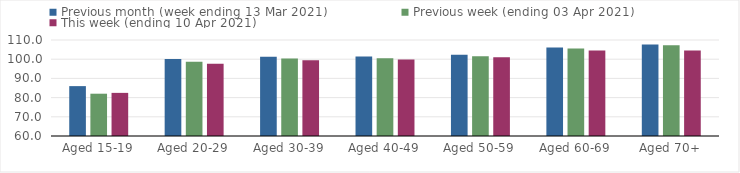
| Category | Previous month (week ending 13 Mar 2021) | Previous week (ending 03 Apr 2021) | This week (ending 10 Apr 2021) |
|---|---|---|---|
| Aged 15-19 | 85.98 | 82.03 | 82.46 |
| Aged 20-29 | 100.16 | 98.68 | 97.6 |
| Aged 30-39 | 101.25 | 100.34 | 99.41 |
| Aged 40-49 | 101.37 | 100.49 | 99.79 |
| Aged 50-59 | 102.38 | 101.6 | 100.99 |
| Aged 60-69 | 106.05 | 105.55 | 104.51 |
| Aged 70+ | 107.72 | 107.33 | 104.58 |